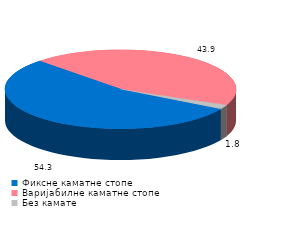
| Category | Series 0 |
|---|---|
| Фиксне каматне стопе | 54.3 |
| Варијабилне каматне стопе | 43.9 |
| Без камате | 1.8 |